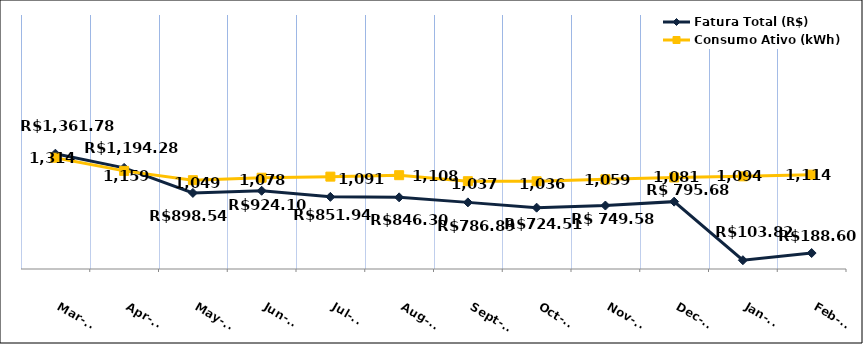
| Category | Fatura Total (R$) |
|---|---|
| 2022-03-01 | 1361.78 |
| 2022-04-01 | 1194.28 |
| 2022-05-01 | 898.54 |
| 2022-06-01 | 924.1 |
| 2022-07-01 | 851.94 |
| 2022-08-01 | 846.3 |
| 2022-09-01 | 786.89 |
| 2022-10-01 | 724.51 |
| 2022-11-01 | 749.58 |
| 2022-12-01 | 795.68 |
| 2023-01-01 | 103.82 |
| 2023-02-01 | 188.6 |